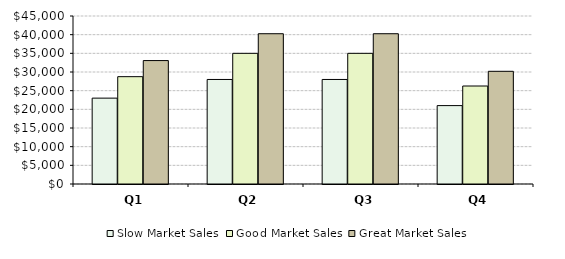
| Category | Slow Market Sales | Good Market Sales | Great Market Sales |
|---|---|---|---|
| Q1 | 23000 | 28750 | 33062.5 |
| Q2 | 28000 | 35000 | 40250 |
| Q3 | 28000 | 35000 | 40250 |
| Q4 | 21000 | 26250 | 30187.5 |